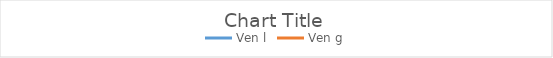
| Category | Ven l | Ven g |
|---|---|---|
| 1900.0 | 0.142 | 0.333 |
| 1901.0 | 0.124 | 0.293 |
| 1902.0 | 0.117 | 0.276 |
| 1903.0 | 0.122 | 0.287 |
| 1904.0 | 0.127 | 0.299 |
| 1905.0 | 0.122 | 0.287 |
| 1906.0 | 0.11 | 0.26 |
| 1907.0 | 0.107 | 0.252 |
| 1908.0 | 0.116 | 0.274 |
| 1909.0 | 0.106 | 0.249 |
| 1910.0 | 0.106 | 0.249 |
| 1911.0 | 0.099 | 0.234 |
| 1912.0 | 0.103 | 0.243 |
| 1913.0 | 0.104 | 0.244 |
| 1914.0 | 0.132 | 0.311 |
| 1915.0 | 0.13 | 0.306 |
| 1916.0 | 0.108 | 0.255 |
| 1917.0 | 0.117 | 0.276 |
| 1918.0 | 0.113 | 0.266 |
| 1919.0 | 0.108 | 0.255 |
| 1920.0 | 0.107 | 0.253 |
| 1921.0 | 0.109 | 0.256 |
| 1922.0 | 0.113 | 0.266 |
| 1923.0 | 0.107 | 0.251 |
| 1924.0 | 0.109 | 0.257 |
| 1925.0 | 0.114 | 0.269 |
| 1926.0 | 0.115 | 0.271 |
| 1927.0 | 0.117 | 0.276 |
| 1928.0 | 0.137 | 0.322 |
| 1929.0 | 0.134 | 0.315 |
| 1930.0 | 0.148 | 0.348 |
| 1931.0 | 0.157 | 0.37 |
| 1932.0 | 0.168 | 0.395 |
| 1933.0 | 0.193 | 0.454 |
| 1934.0 | 0.185 | 0.435 |
| 1935.0 | 0.196 | 0.461 |
| 1936.0 | 0.193 | 0.453 |
| 1937.0 | 0.178 | 0.419 |
| 1938.0 | 0.21 | 0.494 |
| 1939.0 | 0.208 | 0.49 |
| 1940.0 | 0.202 | 0.476 |
| 1941.0 | 0.173 | 0.407 |
| 1942.0 | 0.135 | 0.318 |
| 1943.0 | 0.138 | 0.324 |
| 1944.0 | 0.139 | 0.328 |
| 1945.0 | 0.174 | 0.41 |
| 1946.0 | 0.22 | 0.519 |
| 1947.0 | 0.222 | 0.522 |
| 1948.0 | 0.254 | 0.598 |
| 1949.0 | 0.266 | 0.626 |
| 1950.0 | 0.266 | 0.626 |
| 1951.0 | 0.272 | 0.632 |
| 1952.0 | 0.283 | 0.639 |
| 1953.0 | 0.281 | 0.634 |
| 1954.0 | 0.304 | 0.684 |
| 1955.0 | 0.293 | 0.682 |
| 1956.0 | 0.305 | 0.722 |
| 1957.0 | 0.325 | 0.773 |
| 1958.0 | 0.336 | 0.773 |
| 1959.0 | 0.329 | 0.761 |
| 1960.0 | 0.316 | 0.757 |
| 1961.0 | 0.315 | 0.759 |
| 1962.0 | 0.305 | 0.764 |
| 1963.0 | 0.316 | 0.765 |
| 1964.0 | 0.321 | 0.777 |
| 1965.0 | 0.306 | 0.757 |
| 1966.0 | 0.298 | 0.71 |
| 1967.0 | 0.297 | 0.704 |
| 1968.0 | 0.302 | 0.691 |
| 1969.0 | 0.301 | 0.683 |
| 1970.0 | 0.332 | 0.72 |
| 1971.0 | 0.314 | 0.703 |
| 1972.0 | 0.307 | 0.672 |
| 1973.0 | 0.326 | 0.659 |
| 1974.0 | 0.448 | 0.684 |
| 1975.0 | 0.429 | 0.712 |
| 1976.0 | 0.41 | 0.716 |
| 1977.0 | 0.396 | 0.713 |
| 1978.0 | 0.359 | 0.673 |
| 1979.0 | 0.376 | 0.645 |
| 1980.0 | 0.383 | 0.62 |
| 1981.0 | 0.363 | 0.591 |
| 1982.0 | 0.337 | 0.596 |
| 1983.0 | 0.312 | 0.529 |
| 1984.0 | 0.289 | 0.478 |
| 1985.0 | 0.268 | 0.453 |
| 1986.0 | 0.235 | 0.458 |
| 1987.0 | 0.228 | 0.45 |
| 1988.0 | 0.223 | 0.45 |
| 1989.0 | 0.2 | 0.391 |
| 1990.0 | 0.208 | 0.404 |
| 1991.0 | 0.21 | 0.439 |
| 1992.0 | 0.227 | 0.446 |
| 1993.0 | 0.202 | 0.431 |
| 1994.0 | 0.182 | 0.401 |
| 1995.0 | 0.184 | 0.402 |
| 1996.0 | 0.172 | 0.383 |
| 1997.0 | 0.168 | 0.387 |
| 1998.0 | 0.149 | 0.369 |
| 1999.0 | 0.147 | 0.329 |
| 2000.0 | 0.173 | 0.325 |
| 2001.0 | 0.163 | 0.33 |
| 2002.0 | 0.154 | 0.293 |
| 2003.0 | 0.143 | 0.26 |
| 2004.0 | 0.177 | 0.294 |
| 2005.0 | 0.216 | 0.312 |
| 2006.0 | 0.244 | 0.331 |
| 2007.0 | 0.269 | 0.349 |
| 2008.0 | 0.312 | 0.365 |
| 2009.0 | 0.279 | 0.36 |
| 2010.0 | 0.328 | 0.349 |
| 2011.0 | 0.357 | 0.357 |
| 2012.0 | 0.352 | 0.368 |
| 2013.0 | 0.37 | 0.421 |
| 2014.0 | 0.34 | 0.393 |
| 2015.0 | 0.309 | 0.358 |
| 2016.0 | 0.248 | 0.287 |